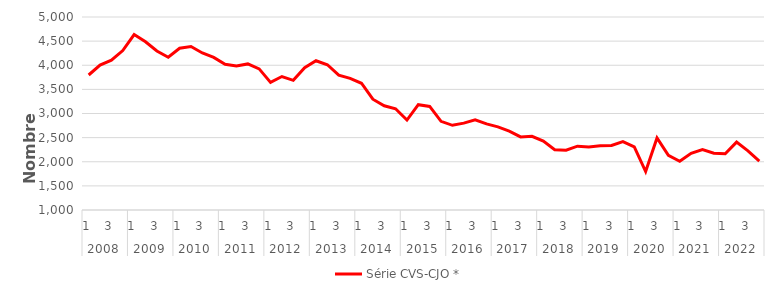
| Category | Série CVS-CJO * |
|---|---|
| 0 | 3798.053 |
| 1 | 4002.54 |
| 2 | 4104.128 |
| 3 | 4303.64 |
| 4 | 4636.998 |
| 5 | 4487.614 |
| 6 | 4295.109 |
| 7 | 4166.536 |
| 8 | 4352.287 |
| 9 | 4388.917 |
| 10 | 4255.288 |
| 11 | 4161.851 |
| 12 | 4020.393 |
| 13 | 3987.16 |
| 14 | 4027.583 |
| 15 | 3924.782 |
| 16 | 3644.573 |
| 17 | 3766.039 |
| 18 | 3686.686 |
| 19 | 3948.23 |
| 20 | 4093.824 |
| 21 | 4010.996 |
| 22 | 3796.511 |
| 23 | 3727.9 |
| 24 | 3626.985 |
| 25 | 3296.187 |
| 26 | 3161.04 |
| 27 | 3098.654 |
| 28 | 2863.662 |
| 29 | 3183.142 |
| 30 | 3146.939 |
| 31 | 2837.595 |
| 32 | 2755.332 |
| 33 | 2800.217 |
| 34 | 2870.704 |
| 35 | 2783.777 |
| 36 | 2722.367 |
| 37 | 2633.448 |
| 38 | 2513.806 |
| 39 | 2526.699 |
| 40 | 2428.487 |
| 41 | 2249.583 |
| 42 | 2240.582 |
| 43 | 2322.269 |
| 44 | 2307.84 |
| 45 | 2331.561 |
| 46 | 2336.338 |
| 47 | 2415.653 |
| 48 | 2306.839 |
| 49 | 1796.468 |
| 50 | 2493.779 |
| 51 | 2132.476 |
| 52 | 2008.887 |
| 53 | 2176.313 |
| 54 | 2252.175 |
| 55 | 2177.856 |
| 56 | 2166.364 |
| 57 | 2407.343 |
| 58 | 2224.478 |
| 59 | 2014.406 |